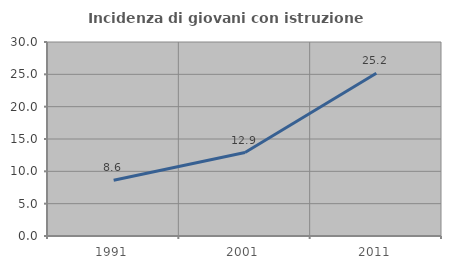
| Category | Incidenza di giovani con istruzione universitaria |
|---|---|
| 1991.0 | 8.609 |
| 2001.0 | 12.903 |
| 2011.0 | 25.17 |